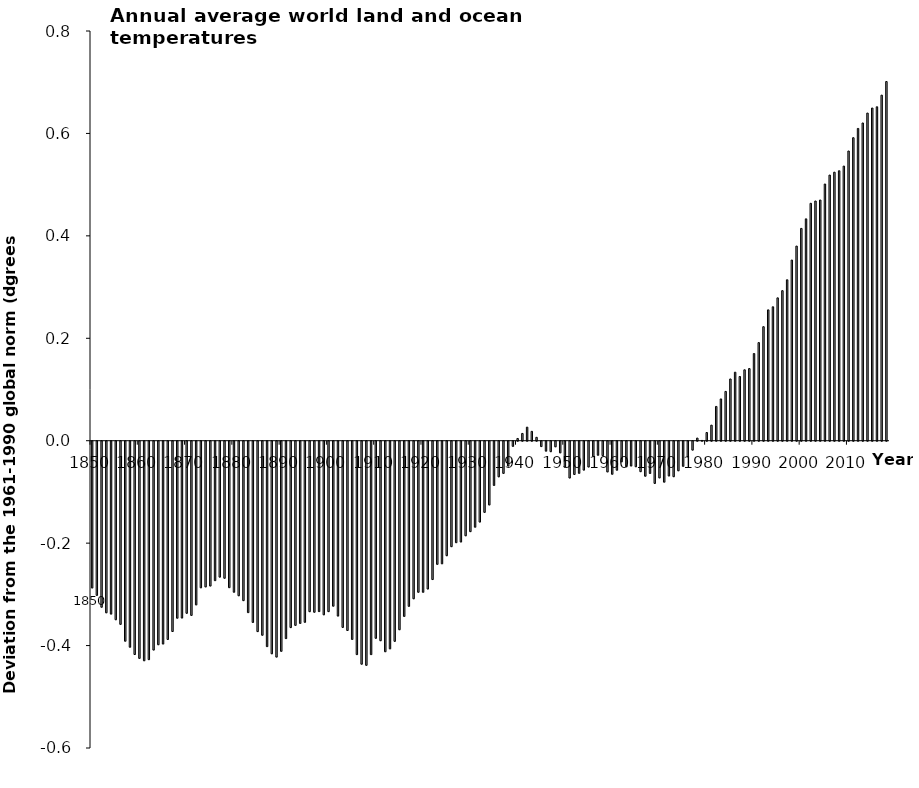
| Category | Series 0 |
|---|---|
| 1850.0 | -0.287 |
| 1851.0 | -0.301 |
| 1852.0 | -0.324 |
| 1853.0 | -0.335 |
| 1854.0 | -0.338 |
| 1855.0 | -0.349 |
| 1856.0 | -0.358 |
| 1857.0 | -0.39 |
| 1858.0 | -0.402 |
| 1859.0 | -0.416 |
| 1860.0 | -0.424 |
| 1861.0 | -0.429 |
| 1862.0 | -0.426 |
| 1863.0 | -0.408 |
| 1864.0 | -0.397 |
| 1865.0 | -0.396 |
| 1866.0 | -0.387 |
| 1867.0 | -0.372 |
| 1868.0 | -0.346 |
| 1869.0 | -0.345 |
| 1870.0 | -0.336 |
| 1871.0 | -0.34 |
| 1872.0 | -0.32 |
| 1873.0 | -0.286 |
| 1874.0 | -0.284 |
| 1875.0 | -0.283 |
| 1876.0 | -0.272 |
| 1877.0 | -0.265 |
| 1878.0 | -0.268 |
| 1879.0 | -0.286 |
| 1880.0 | -0.295 |
| 1881.0 | -0.302 |
| 1882.0 | -0.311 |
| 1883.0 | -0.335 |
| 1884.0 | -0.354 |
| 1885.0 | -0.372 |
| 1886.0 | -0.379 |
| 1887.0 | -0.401 |
| 1888.0 | -0.415 |
| 1889.0 | -0.421 |
| 1890.0 | -0.41 |
| 1891.0 | -0.385 |
| 1892.0 | -0.364 |
| 1893.0 | -0.36 |
| 1894.0 | -0.356 |
| 1895.0 | -0.354 |
| 1896.0 | -0.333 |
| 1897.0 | -0.334 |
| 1898.0 | -0.333 |
| 1899.0 | -0.339 |
| 1900.0 | -0.333 |
| 1901.0 | -0.322 |
| 1902.0 | -0.341 |
| 1903.0 | -0.364 |
| 1904.0 | -0.37 |
| 1905.0 | -0.387 |
| 1906.0 | -0.417 |
| 1907.0 | -0.435 |
| 1908.0 | -0.438 |
| 1909.0 | -0.417 |
| 1910.0 | -0.385 |
| 1911.0 | -0.39 |
| 1912.0 | -0.411 |
| 1913.0 | -0.405 |
| 1914.0 | -0.391 |
| 1915.0 | -0.368 |
| 1916.0 | -0.342 |
| 1917.0 | -0.322 |
| 1918.0 | -0.308 |
| 1919.0 | -0.295 |
| 1920.0 | -0.295 |
| 1921.0 | -0.289 |
| 1922.0 | -0.27 |
| 1923.0 | -0.24 |
| 1924.0 | -0.239 |
| 1925.0 | -0.224 |
| 1926.0 | -0.206 |
| 1927.0 | -0.198 |
| 1928.0 | -0.197 |
| 1929.0 | -0.185 |
| 1930.0 | -0.177 |
| 1931.0 | -0.168 |
| 1932.0 | -0.158 |
| 1933.0 | -0.139 |
| 1934.0 | -0.124 |
| 1935.0 | -0.086 |
| 1936.0 | -0.07 |
| 1937.0 | -0.063 |
| 1938.0 | -0.049 |
| 1939.0 | -0.01 |
| 1940.0 | 0.004 |
| 1941.0 | 0.014 |
| 1942.0 | 0.026 |
| 1943.0 | 0.018 |
| 1944.0 | 0.007 |
| 1945.0 | -0.01 |
| 1946.0 | -0.019 |
| 1947.0 | -0.02 |
| 1948.0 | -0.011 |
| 1949.0 | -0.023 |
| 1950.0 | -0.051 |
| 1951.0 | -0.072 |
| 1952.0 | -0.065 |
| 1953.0 | -0.063 |
| 1954.0 | -0.056 |
| 1955.0 | -0.05 |
| 1956.0 | -0.03 |
| 1957.0 | -0.027 |
| 1958.0 | -0.028 |
| 1959.0 | -0.06 |
| 1960.0 | -0.064 |
| 1961.0 | -0.057 |
| 1962.0 | -0.04 |
| 1963.0 | -0.05 |
| 1964.0 | -0.048 |
| 1965.0 | -0.05 |
| 1966.0 | -0.059 |
| 1967.0 | -0.068 |
| 1968.0 | -0.063 |
| 1969.0 | -0.082 |
| 1970.0 | -0.072 |
| 1971.0 | -0.08 |
| 1972.0 | -0.068 |
| 1973.0 | -0.069 |
| 1974.0 | -0.058 |
| 1975.0 | -0.049 |
| 1976.0 | -0.031 |
| 1977.0 | -0.017 |
| 1978.0 | 0.005 |
| 1979.0 | 0.001 |
| 1980.0 | 0.016 |
| 1981.0 | 0.03 |
| 1982.0 | 0.067 |
| 1983.0 | 0.082 |
| 1984.0 | 0.096 |
| 1985.0 | 0.121 |
| 1986.0 | 0.134 |
| 1987.0 | 0.125 |
| 1988.0 | 0.138 |
| 1989.0 | 0.141 |
| 1990.0 | 0.17 |
| 1991.0 | 0.192 |
| 1992.0 | 0.223 |
| 1993.0 | 0.255 |
| 1994.0 | 0.261 |
| 1995.0 | 0.279 |
| 1996.0 | 0.293 |
| 1997.0 | 0.314 |
| 1998.0 | 0.353 |
| 1999.0 | 0.38 |
| 2000.0 | 0.415 |
| 2001.0 | 0.433 |
| 2002.0 | 0.464 |
| 2003.0 | 0.468 |
| 2004.0 | 0.47 |
| 2005.0 | 0.501 |
| 2006.0 | 0.519 |
| 2007.0 | 0.524 |
| 2008.0 | 0.527 |
| 2009.0 | 0.536 |
| 2010.0 | 0.566 |
| 2011.0 | 0.592 |
| 2012.0 | 0.61 |
| 2013.0 | 0.62 |
| 2014.0 | 0.64 |
| 2015.0 | 0.65 |
| 2016.0 | 0.652 |
| 2017.0 | 0.675 |
| 2018.0 | 0.701 |